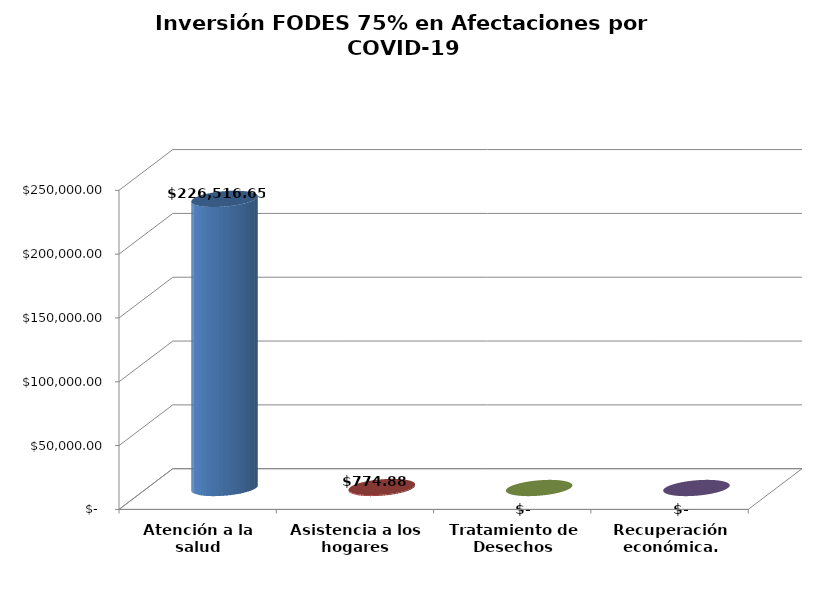
| Category | Series 0 |
|---|---|
| Atención a la salud | 226516.65 |
| Asistencia a los hogares | 774.88 |
| Tratamiento de Desechos | 0 |
| Recuperación económica. | 0 |